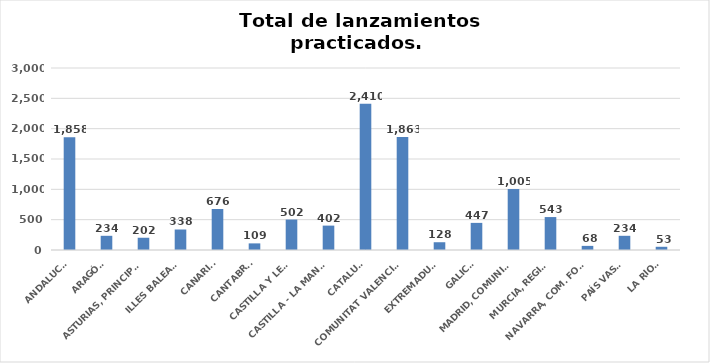
| Category | Series 0 |
|---|---|
| ANDALUCÍA | 1858 |
| ARAGÓN | 234 |
| ASTURIAS, PRINCIPADO | 202 |
| ILLES BALEARS | 338 |
| CANARIAS | 676 |
| CANTABRIA | 109 |
| CASTILLA Y LEÓN | 502 |
| CASTILLA - LA MANCHA | 402 |
| CATALUÑA | 2410 |
| COMUNITAT VALENCIANA | 1863 |
| EXTREMADURA | 128 |
| GALICIA | 447 |
| MADRID, COMUNIDAD | 1005 |
| MURCIA, REGIÓN | 543 |
| NAVARRA, COM. FORAL | 68 |
| PAÍS VASCO | 234 |
| LA RIOJA | 53 |